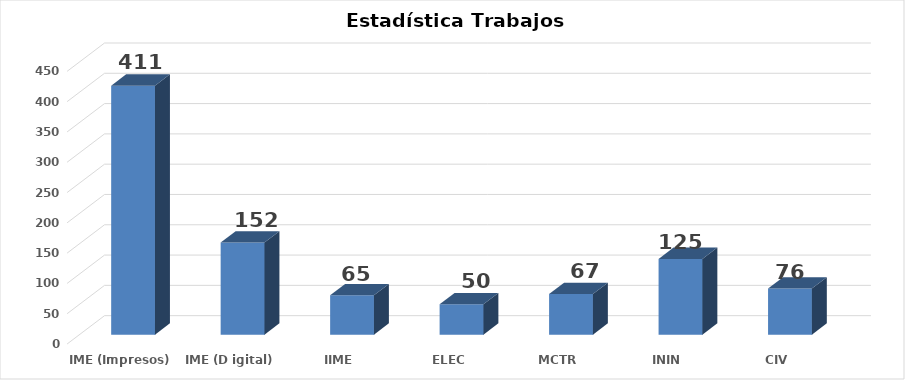
| Category | Series 0 |
|---|---|
| IME (Impresos) | 411 |
| IME (D igital) | 152 |
| IIME | 65 |
| ELEC | 50 |
| MCTR | 67 |
| ININ | 125 |
| CIV | 76 |